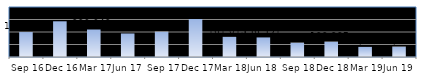
| Category | Series 0 |
|---|---|
| Sep 16 | 199640 |
| Dec 16 | 285736 |
| Mar 17 | 220042 |
| Jun 17 | 188241 |
| Sep 17 | 203062 |
| Dec 17 | 303932 |
| Mar 18 | 161013 |
| Jun 18 | 156591 |
| Sep 18 | 114922 |
| Dec 18 | 122987 |
| Mar 19 | 80739 |
| Jun 19 | 83236 |